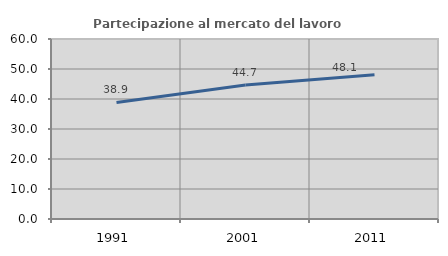
| Category | Partecipazione al mercato del lavoro  femminile |
|---|---|
| 1991.0 | 38.862 |
| 2001.0 | 44.701 |
| 2011.0 | 48.092 |